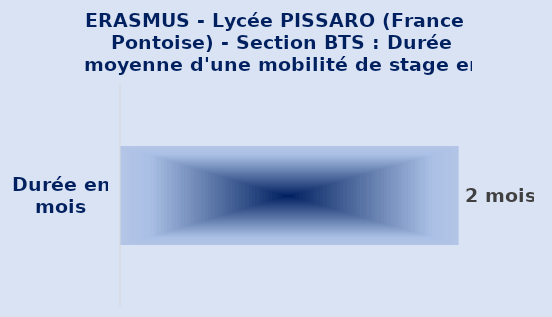
| Category |  Durée en mois d'une mobilité de stage  |
|---|---|
| Durée en mois | 2 |